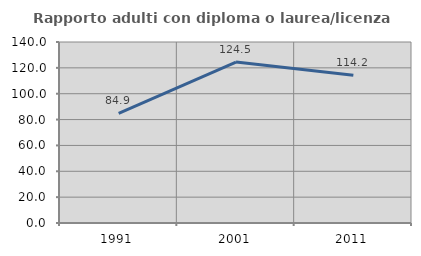
| Category | Rapporto adulti con diploma o laurea/licenza media  |
|---|---|
| 1991.0 | 84.878 |
| 2001.0 | 124.467 |
| 2011.0 | 114.202 |